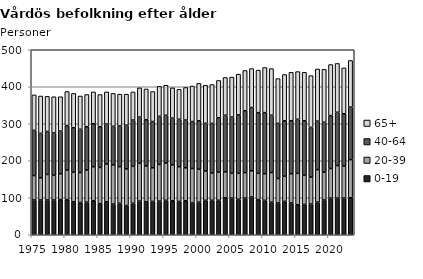
| Category | 0-19 | 20-39 | 40-64 | 65+ |
|---|---|---|---|---|
| 1975.0 | 94 | 66 | 122 | 96 |
| 1976.0 | 94 | 60 | 120 | 101 |
| 1977.0 | 94 | 69 | 116 | 95 |
| 1978.0 | 94 | 67 | 114 | 98 |
| 1979.0 | 95 | 70 | 115 | 93 |
| 1980.0 | 95 | 80 | 120 | 92 |
| 1981.0 | 89 | 80 | 120 | 93 |
| 1982.0 | 87 | 81 | 117 | 90 |
| 1983.0 | 88 | 87 | 117 | 87 |
| 1984.0 | 92 | 92 | 116 | 86 |
| 1985.0 | 84 | 98 | 110 | 87 |
| 1986.0 | 89 | 102 | 108 | 87 |
| 1987.0 | 83 | 106 | 104 | 89 |
| 1988.0 | 85 | 99 | 110 | 86 |
| 1989.0 | 79 | 99 | 118 | 84 |
| 1990.0 | 85 | 100 | 125 | 76 |
| 1991.0 | 91 | 102 | 125 | 79 |
| 1992.0 | 89 | 97 | 125 | 83 |
| 1993.0 | 90 | 91 | 125 | 81 |
| 1994.0 | 91 | 99 | 130 | 81 |
| 1995.0 | 93 | 101 | 129 | 81 |
| 1996.0 | 92 | 97 | 126 | 82 |
| 1997.0 | 90 | 94 | 128 | 81 |
| 1998.0 | 92 | 89 | 129 | 88 |
| 1999.0 | 86 | 93 | 127 | 96 |
| 2000.0 | 88 | 89 | 131 | 101 |
| 2001.0 | 93 | 79 | 129 | 103 |
| 2002.0 | 93 | 74 | 134 | 105 |
| 2003.0 | 93 | 76 | 147 | 101 |
| 2004.0 | 100 | 70 | 153 | 102 |
| 2005.0 | 99 | 67 | 152 | 108 |
| 2006.0 | 96 | 70 | 158 | 110 |
| 2007.0 | 99 | 69 | 167 | 109 |
| 2008.0 | 102 | 71 | 171 | 105 |
| 2009.0 | 95 | 71 | 164 | 115 |
| 2010.0 | 93 | 72 | 165 | 122 |
| 2011.0 | 88 | 80 | 155 | 126 |
| 2012.0 | 86 | 66 | 149 | 121 |
| 2013.0 | 90 | 68 | 150 | 125 |
| 2014.0 | 86 | 79 | 143 | 131 |
| 2015.0 | 81 | 85 | 146 | 129 |
| 2016.0 | 82 | 79 | 147 | 131 |
| 2017.0 | 83 | 73 | 134 | 140 |
| 2018.0 | 88 | 88 | 131 | 141 |
| 2019.0 | 94 | 75 | 135 | 143 |
| 2020.0 | 99 | 80 | 143 | 138 |
| 2021.0 | 99 | 88 | 144 | 132 |
| 2022.0 | 99 | 87 | 141 | 124 |
| 2023.0 | 100 | 103 | 142 | 126 |